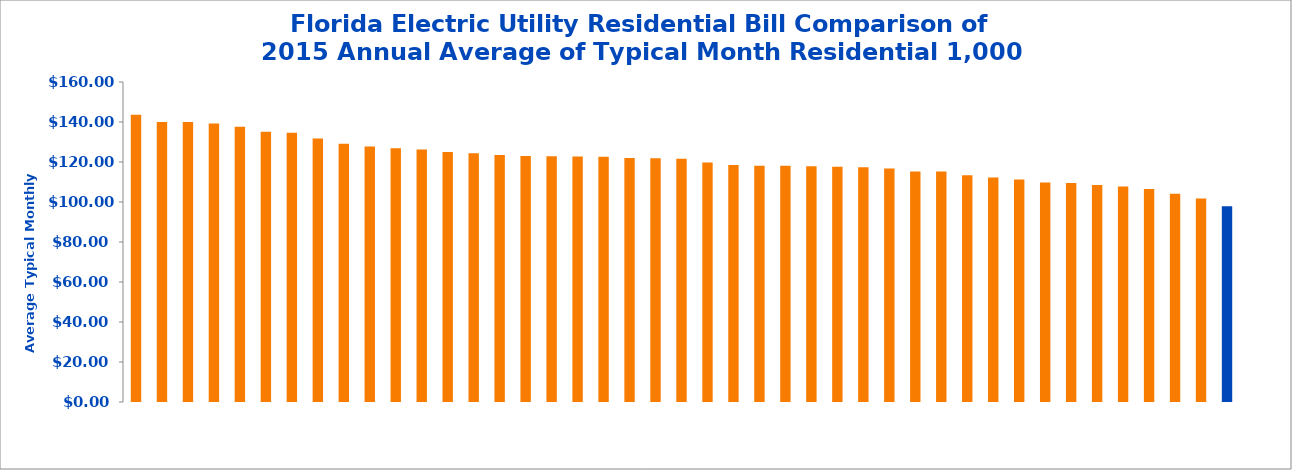
| Category | Avg bill |
|---|---|
| Gainesville Regional Utilities | 143.57 |
| Florida Public Utilities Co - Fernandina Beach | 140 |
| Florida Public Utilities Co - Marianna | 140 |
| Gulf Power Company | 139.29 |
| City of Leesburg | 137.582 |
| City of Bartow | 135.111 |
| City of Fort Meade | 134.677 |
| City of Bushnell | 131.759 |
| City of Alachua | 129.187 |
| Florida Keys Electric Cooperative, Inc | 127.713 |
| Beaches Energy Services (Jacksonville Beach) | 126.832 |
| City of Vero Beach | 126.226 |
| City of Moore Haven | 124.948 |
| Okefenoke Rural Electric Membership Corporation | 124.41 |
| Clay Electric Cooperative, Inc | 123.485 |
| City of Chattahoochee | 122.994 |
| Ocala Electric Utility | 122.863 |
| Duke Energy Florida | 122.77 |
| Keys Energy Services (City of Key West) | 122.674 |
| City of Mount Dora | 121.945 |
| City of Blountstown | 121.9 |
| City of Homestead | 121.612 |
| City of Newberry | 119.784 |
| City of Williston | 118.478 |
| City of Starke | 118.182 |
| City of Tallahassee | 118.17 |
| Fort Pierce Utilities Authority | 117.873 |
| City of Lake Worth | 117.67 |
| Havana Power & Light (City of Havana) | 117.353 |
| City of St. Cloud | 116.73 |
| Jacksonville Electric Authority (JEA) | 115.29 |
| City of Green Cove Springs | 115.257 |
| City of Wauchula | 113.418 |
| Orlando Utilities Commission (OUC) | 112.24 |
| Lakeland Electric | 111.206 |
| New Smyrna Beach Utilities Commission | 109.81 |
| City of Winter Park | 109.559 |
| Tampa Electric Company | 108.545 |
| Reedy Creek Improvement District | 107.71 |
| City of Clewiston | 106.468 |
| City of Quincy | 104.112 |
| Kissimmee Utility Authority | 101.714 |
| Florida Power & Light Company | 97.917 |